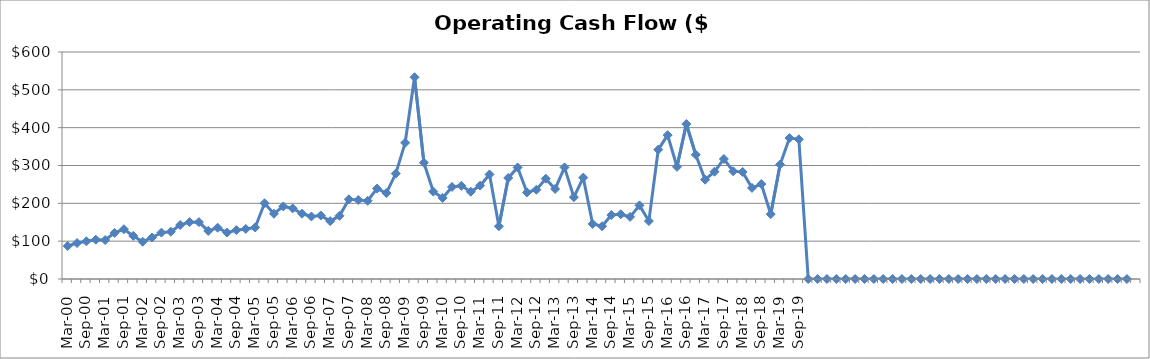
| Category | Operating Cash Flow ($Millions) |
|---|---|
| Mar-00 | 87.106 |
| Jun-00 | 95 |
| Sep-00 | 99.647 |
| Dec-00 | 103.902 |
| Mar-01 | 102.952 |
| Jun-01 | 121.834 |
| Sep-01 | 131.589 |
| Dec-01 | 113.88 |
| Mar-02 | 98.637 |
| Jun-02 | 109.696 |
| Sep-02 | 122.592 |
| Dec-02 | 124.948 |
| Mar-03 | 142.767 |
| Jun-03 | 150.243 |
| Sep-03 | 150.36 |
| Dec-03 | 127.037 |
| Mar-04 | 135.599 |
| Jun-04 | 122.659 |
| Sep-04 | 129.107 |
| Dec-04 | 132.291 |
| Mar-05 | 136.337 |
| Jun-05 | 200.207 |
| Sep-05 | 172.552 |
| Dec-05 | 191.868 |
| Mar-06 | 186.598 |
| Jun-06 | 172.601 |
| Sep-06 | 165.214 |
| Dec-06 | 167.852 |
| Mar-07 | 152.905 |
| Jun-07 | 167.005 |
| Sep-07 | 210.668 |
| Dec-07 | 208.734 |
| Mar-08 | 206.742 |
| Jun-08 | 239.034 |
| Sep-08 | 227.188 |
| Dec-08 | 278.664 |
| Mar-09 | 359.91 |
| Jun-09 | 533.29 |
| Sep-09 | 307.521 |
| Dec-09 | 231.156 |
| Mar-10 | 214.261 |
| Jun-10 | 243.31 |
| Sep-10 | 246.332 |
| Dec-10 | 230.578 |
| Mar-11 | 246.842 |
| Jun-11 | 276.334 |
| Sep-11 | 139.358 |
| Dec-11 | 267.05 |
| Mar-12 | 294.879 |
| Jun-12 | 228.81 |
| Sep-12 | 235.956 |
| Dec-12 | 265.188 |
| Mar-13 | 238.034 |
| Jun-13 | 294.964 |
| Sep-13 | 216.346 |
| Dec-13 | 268 |
| Mar-14 | 145.654 |
| Jun-14 | 139.427 |
| Sep-14 | 169.183 |
| Dec-14 | 171.134 |
| Mar-15 | 164.198 |
| Jun-15 | 194.576 |
| Sep-15 | 153.099 |
| Dec-15 | 341.902 |
| Mar-16 | 380.26 |
| Jun-16 | 296.609 |
| Sep-16 | 409.589 |
| Dec-16 | 328.454 |
| Mar-17 | 262.514 |
| Jun-17 | 283.535 |
| Sep-17 | 317.283 |
| Dec-17 | 284.684 |
| Mar-18 | 282.93 |
| Jun-18 | 240.756 |
| Sep-18 | 250.893 |
| Dec-18 | 171.374 |
| Mar-19 | 302.497 |
| Jun-19 | 372.456 |
| Sep-19 | 369.3 |